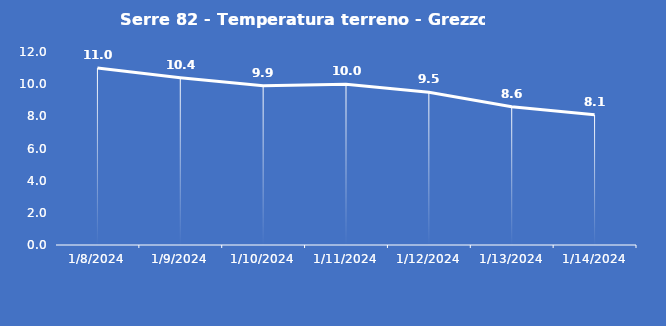
| Category | Serre 82 - Temperatura terreno - Grezzo (°C) |
|---|---|
| 1/8/24 | 11 |
| 1/9/24 | 10.4 |
| 1/10/24 | 9.9 |
| 1/11/24 | 10 |
| 1/12/24 | 9.5 |
| 1/13/24 | 8.6 |
| 1/14/24 | 8.1 |